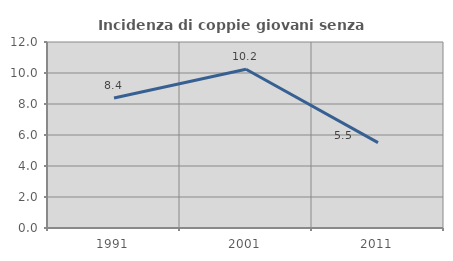
| Category | Incidenza di coppie giovani senza figli |
|---|---|
| 1991.0 | 8.387 |
| 2001.0 | 10.239 |
| 2011.0 | 5.51 |